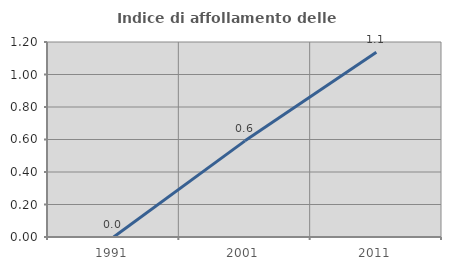
| Category | Indice di affollamento delle abitazioni  |
|---|---|
| 1991.0 | 0 |
| 2001.0 | 0.592 |
| 2011.0 | 1.136 |